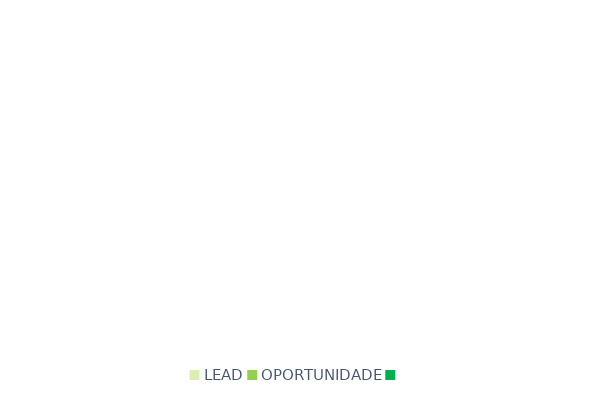
| Category | Series 0 |
|---|---|
| LEAD | 0 |
| OPORTUNIDADE | 0 |